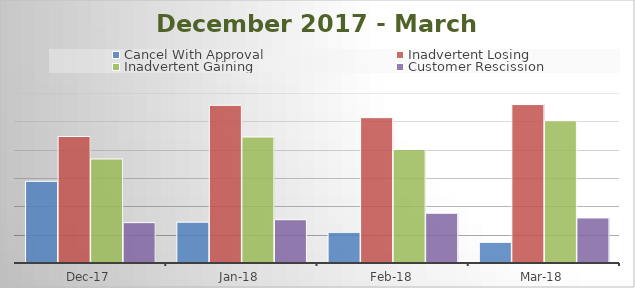
| Category | Cancel With Approval | Inadvertent Losing | Inadvertent Gaining | Customer Rescission |
|---|---|---|---|---|
| 2017-12-01 | 1441 | 2233 | 1836 | 712 |
| 2018-01-01 | 720 | 2782 | 2223 | 764 |
| 2018-02-01 | 541 | 2565 | 2003 | 878 |
| 2018-03-01 | 364 | 2796 | 2510 | 795 |